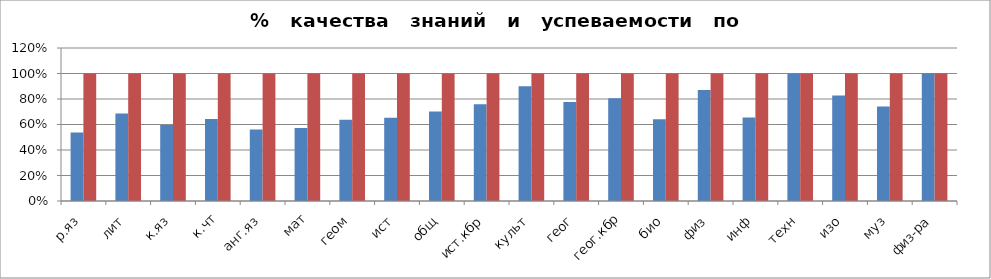
| Category | Series 0 | 2 |
|---|---|---|
| р.яз | 0.538 | 1 |
| лит | 0.686 | 1 |
| к.яз | 0.596 | 1 |
| к.чт | 0.643 | 1 |
| анг.яз | 0.561 | 1 |
| мат | 0.573 | 1 |
| геом | 0.637 | 1 |
| ист | 0.652 | 1 |
| общ | 0.703 | 1 |
| ист.кбр | 0.758 | 1 |
| культ | 0.9 | 1 |
| геог | 0.776 | 1 |
| геог.кбр | 0.806 | 1 |
| био | 0.64 | 1 |
| физ | 0.87 | 1 |
| инф | 0.655 | 1 |
| техн | 1 | 1 |
| изо | 0.828 | 1 |
| муз | 0.742 | 1 |
| физ-ра | 1 | 1 |